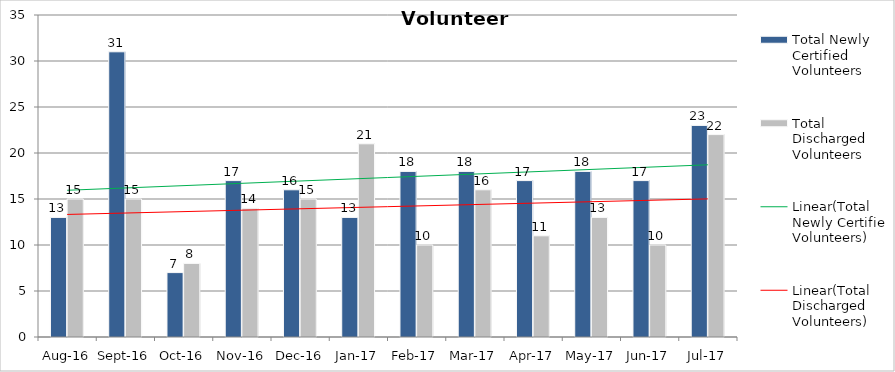
| Category | Total Newly Certified Volunteers | Total Discharged Volunteers |
|---|---|---|
| Aug-16 | 13 | 15 |
| Sep-16 | 31 | 15 |
| Oct-16 | 7 | 8 |
| Nov-16 | 17 | 14 |
| Dec-16 | 16 | 15 |
| Jan-17 | 13 | 21 |
| Feb-17 | 18 | 10 |
| Mar-17 | 18 | 16 |
| Apr-17 | 17 | 11 |
| May-17 | 18 | 13 |
| Jun-17 | 17 | 10 |
| Jul-17 | 23 | 22 |